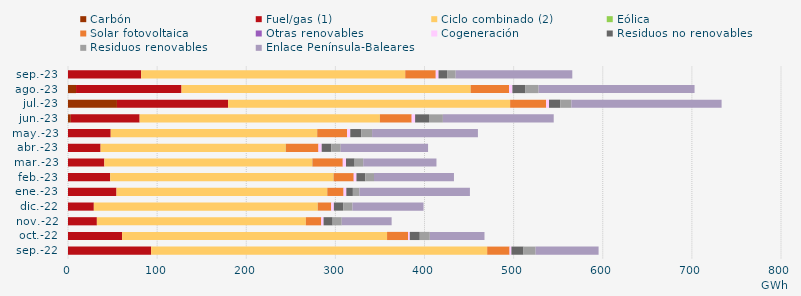
| Category | Carbón | Fuel/gas (1) | Ciclo combinado (2) | Eólica | Solar fotovoltaica | Otras renovables | Cogeneración | Residuos no renovables | Residuos renovables | Enlace Península-Baleares |
|---|---|---|---|---|---|---|---|---|---|---|
| sep.-22 | -0.604 | 93.246 | 377.074 | 0.013 | 25.078 | 0.072 | 2.037 | 13.582 | 13.582 | 70.647 |
| oct.-22 | -0.613 | 60.669 | 297.321 | 0.003 | 23.564 | 0.097 | 1.827 | 11.231 | 11.231 | 61.365 |
| nov.-22 | -0.588 | 32.394 | 234.48 | 0.026 | 17.218 | 0.085 | 2.554 | 10.189 | 10.189 | 55.992 |
| dic.-22 | -0.627 | 28.98 | 251.185 | 0.101 | 15.034 | 0.077 | 2.941 | 10.414 | 10.414 | 79.779 |
| ene.-23 | -0.728 | 54.403 | 236.334 | 0.216 | 18.188 | 0.094 | 3.048 | 7.362 | 7.362 | 123.95 |
| feb.-23 | -0.707 | 47.337 | 250.507 | 0.183 | 22.493 | 0.136 | 3.002 | 9.83 | 9.83 | 89.734 |
| mar.-23 | -0.518 | 40.752 | 233.282 | 0.2 | 34.018 | 0.112 | 3.586 | 9.638 | 9.638 | 82.194 |
| abr.-23 | -0.609 | 36.577 | 207.738 | 0.127 | 36.519 | 0.074 | 3.62 | 10.657 | 10.657 | 98.033 |
| may.-23 | -0.833 | 47.925 | 231.475 | 0.25 | 33.46 | 0.09 | 3.518 | 12.229 | 12.229 | 118.762 |
| jun.-23 | 3.18 | 77.204 | 269.55 | 0.056 | 35.587 | 0.084 | 3.789 | 15.598 | 15.598 | 124.35 |
| jul.-23 | 54.925 | 124.683 | 316.355 | 0.119 | 40.356 | 0.037 | 3.245 | 12.541 | 12.541 | 168.548 |
| ago.-23 | 9.023 | 118.34 | 324.377 | 0.098 | 43.03 | 0.027 | 3.74 | 14.683 | 14.683 | 175.009 |
| sep.-23 | -0.823 | 82.062 | 296.323 | 0 | 34.236 | 0.032 | 3.105 | 9.61 | 9.61 | 130.855 |